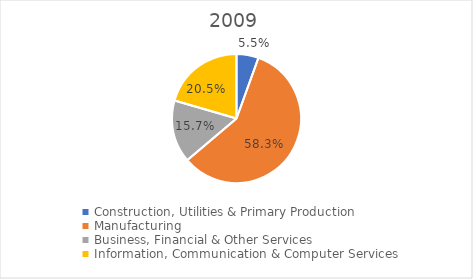
| Category | 2009 |
|---|---|
| Construction, Utilities & Primary Production  | 0.055 |
| Manufacturing  | 0.583 |
| Business, Financial & Other Services | 0.157 |
| Information, Communication & Computer Services | 0.205 |